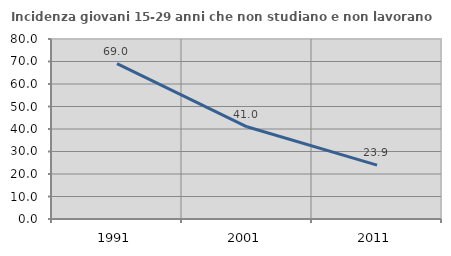
| Category | Incidenza giovani 15-29 anni che non studiano e non lavorano  |
|---|---|
| 1991.0 | 69.037 |
| 2001.0 | 40.984 |
| 2011.0 | 23.936 |